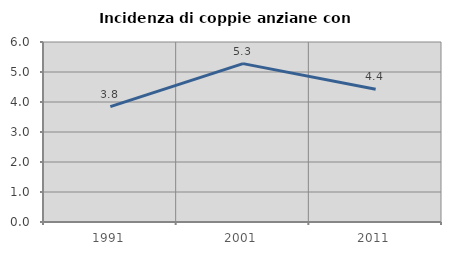
| Category | Incidenza di coppie anziane con figli |
|---|---|
| 1991.0 | 3.846 |
| 2001.0 | 5.279 |
| 2011.0 | 4.427 |